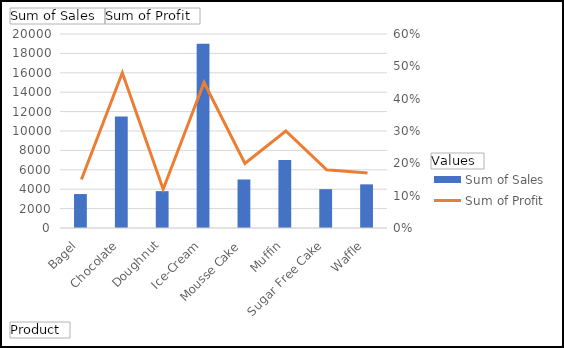
| Category | Sum of Sales |
|---|---|
| Bagel | 3500 |
| Chocolate | 11500 |
| Doughnut | 3800 |
| Ice-Cream | 19000 |
| Mousse Cake | 5000 |
| Muffin | 7000 |
| Sugar Free Cake | 4000 |
| Waffle | 4500 |